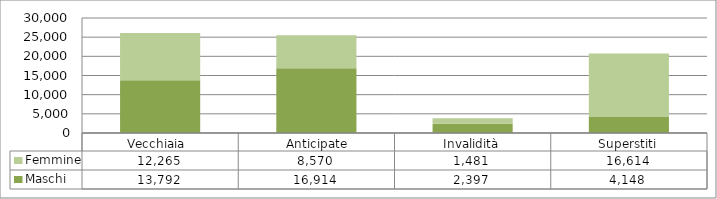
| Category | Maschi | Femmine |
|---|---|---|
| Vecchiaia  | 13792 | 12265 |
|  Anticipate | 16914 | 8570 |
| Invalidità | 2397 | 1481 |
| Superstiti | 4148 | 16614 |